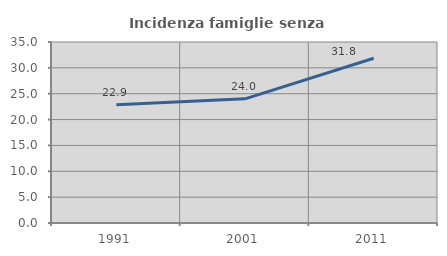
| Category | Incidenza famiglie senza nuclei |
|---|---|
| 1991.0 | 22.879 |
| 2001.0 | 24.005 |
| 2011.0 | 31.849 |